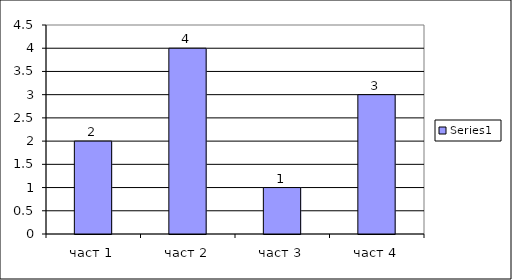
| Category | Series 0 |
|---|---|
| част 1 | 2 |
| част 2 | 4 |
| част 3 | 1 |
| част 4 | 3 |